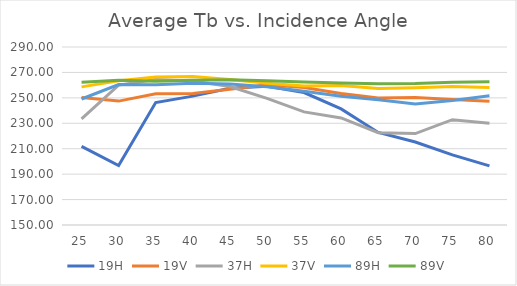
| Category | 19H | 19V | 37H | 37V | 89H | 89V |
|---|---|---|---|---|---|---|
| 25.0 | 211.812 | 250.207 | 233.455 | 258.638 | 249.084 | 262.193 |
| 30.0 | 196.779 | 247.446 | 260.004 | 263.498 | 260.503 | 263.895 |
| 35.0 | 246.314 | 253.167 | 264.513 | 266.346 | 260.393 | 263.052 |
| 40.0 | 251.361 | 253.395 | 263.29 | 266.743 | 261.523 | 263.928 |
| 45.0 | 257.592 | 256.79 | 258.873 | 264.462 | 260.837 | 264.199 |
| 50.0 | 259.14 | 260.347 | 249.608 | 261.53 | 258.735 | 263.511 |
| 55.0 | 254.194 | 258.184 | 238.947 | 259.396 | 255.222 | 262.439 |
| 60.0 | 241.338 | 253.51 | 234.206 | 259.726 | 251.341 | 261.673 |
| 65.0 | 222.777 | 249.804 | 222.629 | 257.415 | 248.467 | 261.1 |
| 70.0 | 215.254 | 250.337 | 221.906 | 257.975 | 245.264 | 261.213 |
| 75.0 | 205.144 | 248.716 | 232.829 | 258.879 | 248 | 262.18 |
| 80.0 | 196.497 | 247.353 | 230.063 | 258.222 | 251.642 | 262.712 |